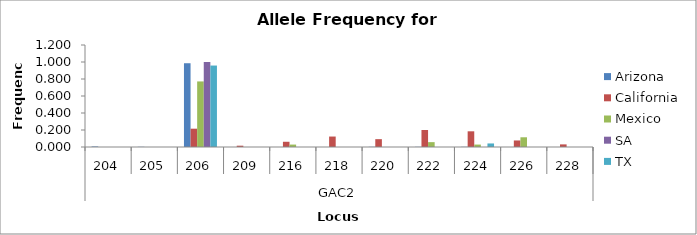
| Category | Arizona | California | Mexico | SA | TX |
|---|---|---|---|---|---|
| 0 | 0.006 | 0 | 0 | 0 | 0 |
| 1 | 0.002 | 0 | 0 | 0 | 0 |
| 2 | 0.985 | 0.215 | 0.771 | 1 | 0.958 |
| 3 | 0 | 0.015 | 0 | 0 | 0 |
| 4 | 0 | 0.062 | 0.029 | 0 | 0 |
| 5 | 0 | 0.123 | 0 | 0 | 0 |
| 6 | 0.002 | 0.092 | 0 | 0 | 0 |
| 7 | 0.002 | 0.2 | 0.057 | 0 | 0 |
| 8 | 0.002 | 0.185 | 0.029 | 0 | 0.042 |
| 9 | 0 | 0.077 | 0.114 | 0 | 0 |
| 10 | 0 | 0.031 | 0 | 0 | 0 |